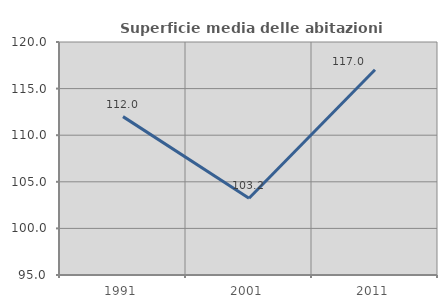
| Category | Superficie media delle abitazioni occupate |
|---|---|
| 1991.0 | 111.992 |
| 2001.0 | 103.239 |
| 2011.0 | 117.019 |